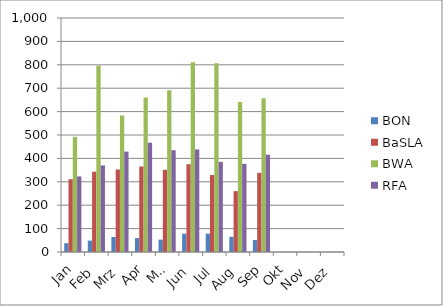
| Category | BON | BaSLA | BWA | RFA |
|---|---|---|---|---|
| Jan | 37.318 | 310.909 | 492 | 323 |
| Feb | 48.75 | 343.25 | 796.25 | 370.1 |
| Mrz | 64 | 352.65 | 583.25 | 429.1 |
| Apr | 59.333 | 365.333 | 660.286 | 466.81 |
| Mai | 52.9 | 351.35 | 690.95 | 435.05 |
| Jun | 78.2 | 375.1 | 810.75 | 438.05 |
| Jul | 78.261 | 328.783 | 806.217 | 385.174 |
| Aug | 64.905 | 260.095 | 641.286 | 376.714 |
| Sep | 51 | 338.238 | 656.952 | 415.762 |
| Okt | 0 | 0 | 0 | 0 |
| Nov | 0 | 0 | 0 | 0 |
| Dez | 0 | 0 | 0 | 0 |